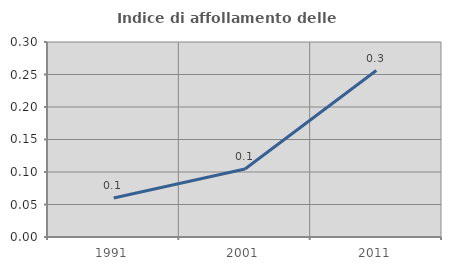
| Category | Indice di affollamento delle abitazioni  |
|---|---|
| 1991.0 | 0.06 |
| 2001.0 | 0.105 |
| 2011.0 | 0.256 |